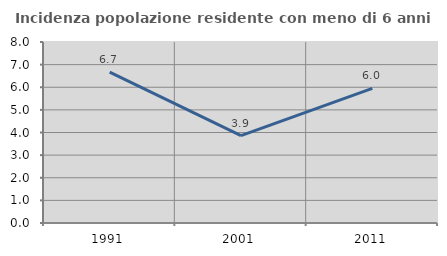
| Category | Incidenza popolazione residente con meno di 6 anni |
|---|---|
| 1991.0 | 6.667 |
| 2001.0 | 3.859 |
| 2011.0 | 5.954 |